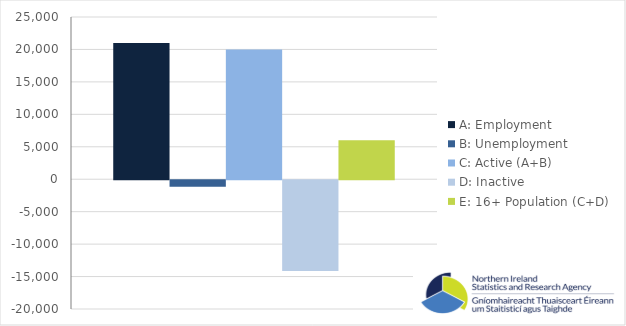
| Category | A: Employment | B: Unemployment | C: Active (A+B) | D: Inactive | E: 16+ Population (C+D) |
|---|---|---|---|---|---|
| 0 | 21000 | -1000 | 20000 | -14000 | 6000 |